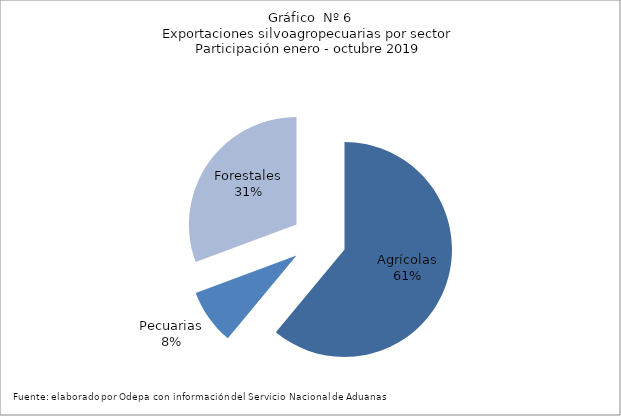
| Category | Series 0 |
|---|---|
| Agrícolas | 8741379 |
| Pecuarias | 1192547 |
| Forestales | 4390854 |